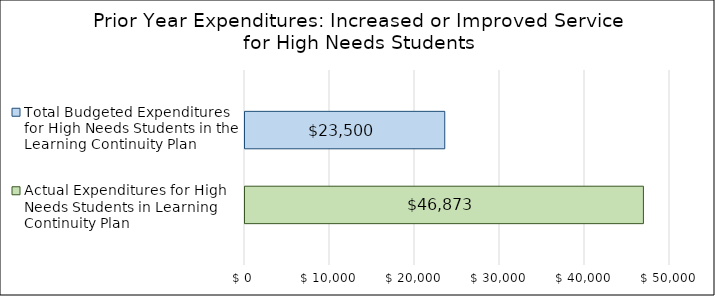
| Category | Actual Expenditures for High Needs Students in Learning Continuity Plan | Total Budgeted Expenditures for High Needs Students in the Learning Continuity Plan |
|---|---|---|
| 0 | 46873 | 23500 |